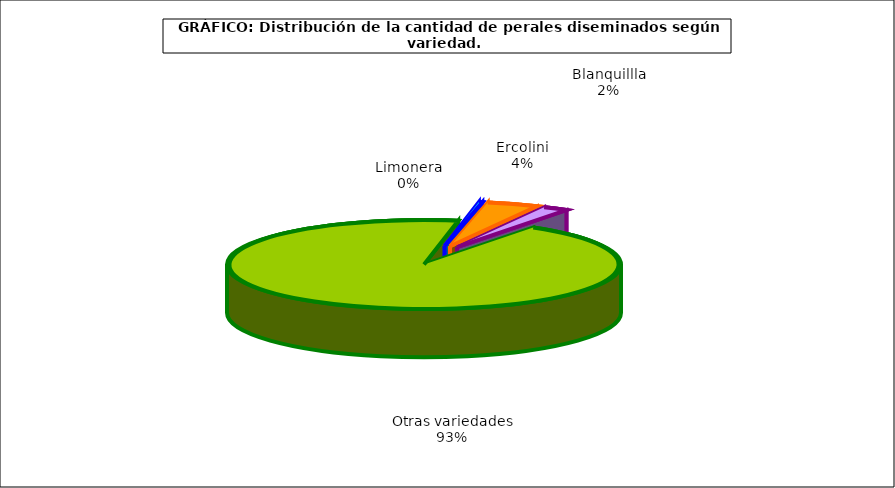
| Category | arboles |
|---|---|
| 0 | 1.383 |
| 1 | 20.507 |
| 2 | 10.112 |
| 3 | 454.625 |